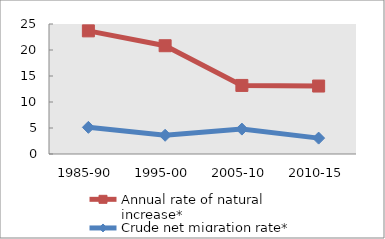
| Category | Annual rate of natural increase* | Crude net migration rate* |
|---|---|---|
| 1985-90 | 23.68 | 5.126 |
| 1995-00 | 20.821 | 3.602 |
| 2005-10 | 13.186 | 4.791 |
| 2010-15 | 13.069 | 3.055 |